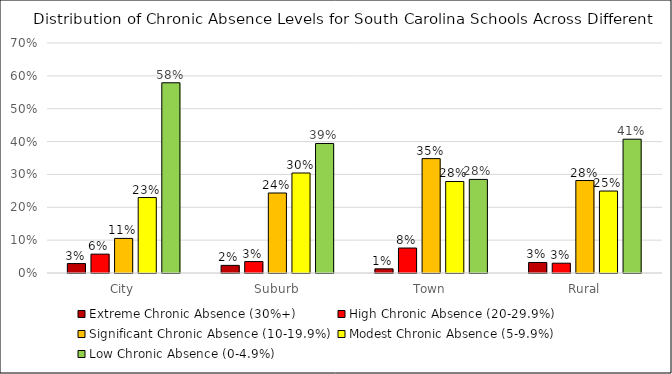
| Category | Extreme Chronic Absence (30%+) | High Chronic Absence (20-29.9%) | Significant Chronic Absence (10-19.9%) | Modest Chronic Absence (5-9.9%) | Low Chronic Absence (0-4.9%) |
|---|---|---|---|---|---|
| City | 0.029 | 0.057 | 0.105 | 0.23 | 0.579 |
| Suburb | 0.023 | 0.035 | 0.243 | 0.304 | 0.394 |
| Town | 0.013 | 0.076 | 0.348 | 0.278 | 0.285 |
| Rural | 0.032 | 0.03 | 0.281 | 0.249 | 0.407 |